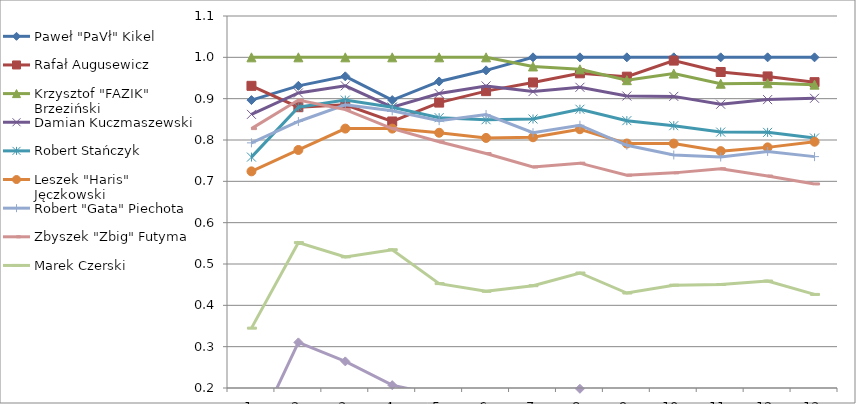
| Category | Paweł "PaVł" Kikel | Rafał Augusewicz | Krzysztof "FAZIK" Brzeziński | Damian Kuczmaszewski | Robert Stańczyk | Leszek "Haris" Jęczkowski | Robert "Gata" Piechota | Zbyszek "Zbig" Futyma | Marek Czerski | Natalia Czerska |
|---|---|---|---|---|---|---|---|---|---|---|
| 0 | 0.897 | 0.931 | 1 | 0.862 | 0.759 | 0.724 | 0.793 | 0.828 | 0.345 | 0.069 |
| 1 | 0.931 | 0.879 | 1 | 0.914 | 0.879 | 0.776 | 0.845 | 0.897 | 0.552 | 0.31 |
| 2 | 0.954 | 0.885 | 1 | 0.931 | 0.897 | 0.828 | 0.885 | 0.874 | 0.517 | 0.264 |
| 3 | 0.897 | 0.845 | 1 | 0.879 | 0.879 | 0.828 | 0.871 | 0.828 | 0.534 | 0.207 |
| 4 | 0.942 | 0.891 | 1 | 0.912 | 0.854 | 0.818 | 0.847 | 0.796 | 0.453 | 0.182 |
| 5 | 0.969 | 0.918 | 1 | 0.931 | 0.849 | 0.805 | 0.862 | 0.767 | 0.434 | 0.189 |
| 6 | 1 | 0.939 | 0.978 | 0.917 | 0.851 | 0.807 | 0.818 | 0.735 | 0.448 | 0.188 |
| 7 | 1 | 0.961 | 0.971 | 0.928 | 0.874 | 0.826 | 0.836 | 0.744 | 0.478 | 0.198 |
| 8 | 1 | 0.953 | 0.945 | 0.906 | 0.847 | 0.791 | 0.787 | 0.715 | 0.43 | 0.179 |
| 9 | 1 | 0.992 | 0.961 | 0.906 | 0.835 | 0.791 | 0.764 | 0.72 | 0.449 | 0.181 |
| 10 | 1 | 0.965 | 0.936 | 0.887 | 0.819 | 0.773 | 0.759 | 0.73 | 0.45 | 0.163 |
| 11 | 1 | 0.954 | 0.937 | 0.898 | 0.818 | 0.782 | 0.772 | 0.713 | 0.459 | 0.162 |
| 12 | 1 | 0.94 | 0.934 | 0.901 | 0.805 | 0.796 | 0.76 | 0.694 | 0.426 | 0.147 |